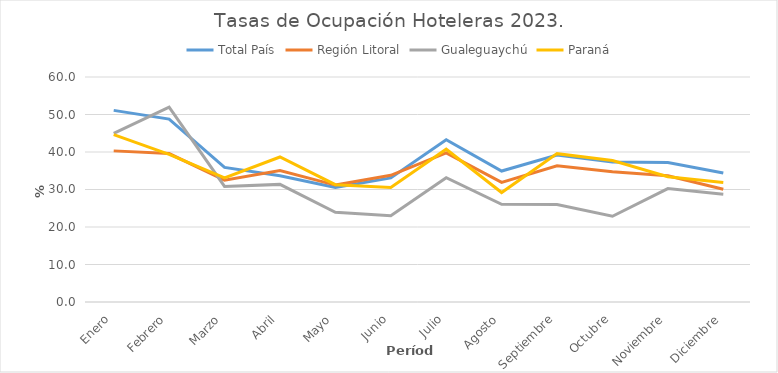
| Category | Total País | Región Litoral | Gualeguaychú | Paraná |
|---|---|---|---|---|
| Enero | 51.103 | 40.3 | 44.958 | 44.614 |
| Febrero | 48.763 | 39.585 | 51.93 | 39.372 |
| Marzo | 35.881 | 32.496 | 30.814 | 33.074 |
| Abril | 33.642 | 35.065 | 31.366 | 38.669 |
| Mayo | 30.515 | 31.178 | 23.922 | 31.288 |
| Junio | 33.08 | 33.773 | 23.005 | 30.515 |
| Julio | 43.272 | 39.762 | 33.128 | 40.739 |
| Agosto | 34.921 | 31.889 | 26.058 | 29.193 |
| Septiembre | 39.204 | 36.328 | 25.98 | 39.563 |
| Octubre | 37.33 | 34.739 | 22.856 | 37.75 |
| Noviembre | 37.221 | 33.684 | 30.232 | 33.388 |
| Diciembre | 34.417 | 30.084 | 28.714 | 31.887 |